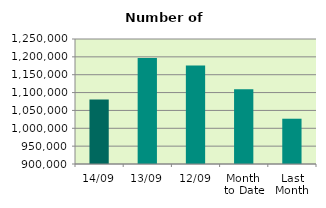
| Category | Series 0 |
|---|---|
| 14/09 | 1080748 |
| 13/09 | 1196686 |
| 12/09 | 1176138 |
| Month 
to Date | 1109602 |
| Last
Month | 1026775.304 |